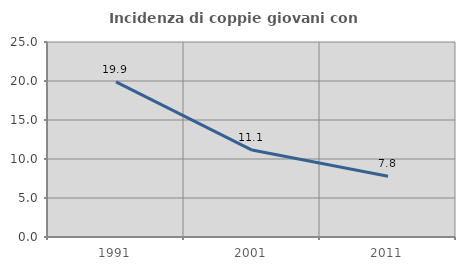
| Category | Incidenza di coppie giovani con figli |
|---|---|
| 1991.0 | 19.892 |
| 2001.0 | 11.149 |
| 2011.0 | 7.784 |